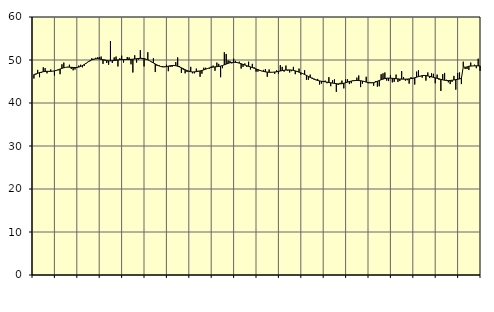
| Category | Piggar | Series 1 |
|---|---|---|
| nan | 45.7 | 46.63 |
| 1.0 | 46.6 | 46.76 |
| 1.0 | 47.7 | 46.9 |
| 1.0 | 46 | 47.05 |
| 1.0 | 47 | 47.17 |
| 1.0 | 48.3 | 47.28 |
| 1.0 | 48.1 | 47.33 |
| 1.0 | 46.9 | 47.36 |
| 1.0 | 47.3 | 47.36 |
| 1.0 | 47.8 | 47.36 |
| 1.0 | 47.4 | 47.39 |
| 1.0 | 46.4 | 47.47 |
| nan | 47.5 | 47.58 |
| 2.0 | 47.6 | 47.74 |
| 2.0 | 46.7 | 47.9 |
| 2.0 | 49 | 48.06 |
| 2.0 | 49.4 | 48.2 |
| 2.0 | 48.3 | 48.29 |
| 2.0 | 48.4 | 48.34 |
| 2.0 | 48.9 | 48.33 |
| 2.0 | 47.9 | 48.3 |
| 2.0 | 47.6 | 48.27 |
| 2.0 | 47.8 | 48.24 |
| 2.0 | 48.2 | 48.27 |
| nan | 48.7 | 48.35 |
| 3.0 | 48.9 | 48.5 |
| 3.0 | 48.3 | 48.71 |
| 3.0 | 48.6 | 48.97 |
| 3.0 | 49.2 | 49.26 |
| 3.0 | 49.6 | 49.55 |
| 3.0 | 49.7 | 49.81 |
| 3.0 | 50.4 | 50.03 |
| 3.0 | 50 | 50.19 |
| 3.0 | 50.5 | 50.27 |
| 3.0 | 50.6 | 50.29 |
| 3.0 | 50.7 | 50.25 |
| nan | 50.8 | 50.16 |
| 4.0 | 49.1 | 50.05 |
| 4.0 | 50.1 | 49.95 |
| 4.0 | 49.3 | 49.86 |
| 4.0 | 48.9 | 49.81 |
| 4.0 | 54.4 | 49.8 |
| 4.0 | 49.3 | 49.83 |
| 4.0 | 50.6 | 49.88 |
| 4.0 | 50.8 | 49.95 |
| 4.0 | 48.5 | 50.02 |
| 4.0 | 50.4 | 50.07 |
| 4.0 | 51 | 50.09 |
| nan | 49.4 | 50.09 |
| 5.0 | 50 | 50.1 |
| 5.0 | 50.7 | 50.11 |
| 5.0 | 50.6 | 50.12 |
| 5.0 | 49 | 50.15 |
| 5.0 | 47.1 | 50.19 |
| 5.0 | 51.1 | 50.24 |
| 5.0 | 49.4 | 50.3 |
| 5.0 | 50.1 | 50.35 |
| 5.0 | 52.3 | 50.38 |
| 5.0 | 50.2 | 50.38 |
| 5.0 | 48.5 | 50.32 |
| nan | 50.1 | 50.2 |
| 6.0 | 51.8 | 50.03 |
| 6.0 | 49.8 | 49.82 |
| 6.0 | 49.5 | 49.58 |
| 6.0 | 50.4 | 49.32 |
| 6.0 | 47.2 | 49.08 |
| 6.0 | 48.6 | 48.84 |
| 6.0 | 48.8 | 48.63 |
| 6.0 | 48.5 | 48.48 |
| 6.0 | 48.6 | 48.4 |
| 6.0 | 48.5 | 48.39 |
| 6.0 | 48.9 | 48.46 |
| nan | 47.4 | 48.57 |
| 7.0 | 48.4 | 48.67 |
| 7.0 | 48.4 | 48.72 |
| 7.0 | 48.7 | 48.73 |
| 7.0 | 49.5 | 48.67 |
| 7.0 | 50.6 | 48.55 |
| 7.0 | 48.6 | 48.38 |
| 7.0 | 47 | 48.19 |
| 7.0 | 47.7 | 47.97 |
| 7.0 | 46.9 | 47.75 |
| 7.0 | 47.2 | 47.54 |
| 7.0 | 47.5 | 47.38 |
| nan | 48.4 | 47.27 |
| 8.0 | 46.9 | 47.22 |
| 8.0 | 46.9 | 47.24 |
| 8.0 | 48 | 47.29 |
| 8.0 | 47.5 | 47.37 |
| 8.0 | 46.1 | 47.46 |
| 8.0 | 46.8 | 47.57 |
| 8.0 | 48.2 | 47.7 |
| 8.0 | 48.2 | 47.86 |
| 8.0 | 48.1 | 48.02 |
| 8.0 | 48 | 48.16 |
| 8.0 | 48.5 | 48.27 |
| nan | 48.7 | 48.35 |
| 9.0 | 47.5 | 48.4 |
| 9.0 | 49.4 | 48.45 |
| 9.0 | 49.1 | 48.5 |
| 9.0 | 46 | 48.58 |
| 9.0 | 48.1 | 48.71 |
| 9.0 | 51.8 | 48.87 |
| 9.0 | 51.4 | 49.05 |
| 9.0 | 49.9 | 49.22 |
| 9.0 | 49.8 | 49.35 |
| 9.0 | 49.2 | 49.44 |
| 9.0 | 50.3 | 49.47 |
| nan | 49.8 | 49.45 |
| 10.0 | 49.3 | 49.38 |
| 10.0 | 49.6 | 49.27 |
| 10.0 | 48 | 49.13 |
| 10.0 | 48.4 | 48.98 |
| 10.0 | 49.2 | 48.82 |
| 10.0 | 48.4 | 48.67 |
| 10.0 | 49.6 | 48.53 |
| 10.0 | 47.8 | 48.39 |
| 10.0 | 49.1 | 48.24 |
| 10.0 | 48.3 | 48.08 |
| 10.0 | 47.3 | 47.92 |
| nan | 47.3 | 47.76 |
| 11.0 | 47.5 | 47.6 |
| 11.0 | 47.4 | 47.46 |
| 11.0 | 47.7 | 47.34 |
| 11.0 | 47.9 | 47.25 |
| 11.0 | 46.1 | 47.19 |
| 11.0 | 47.8 | 47.15 |
| 11.0 | 47.1 | 47.15 |
| 11.0 | 47.2 | 47.16 |
| 11.0 | 46.8 | 47.21 |
| 11.0 | 47.6 | 47.27 |
| 11.0 | 46.8 | 47.35 |
| nan | 48.8 | 47.44 |
| 12.0 | 48.4 | 47.54 |
| 12.0 | 47.3 | 47.61 |
| 12.0 | 48.7 | 47.66 |
| 12.0 | 47.5 | 47.69 |
| 12.0 | 47.1 | 47.69 |
| 12.0 | 47.4 | 47.66 |
| 12.0 | 48.4 | 47.58 |
| 12.0 | 46.7 | 47.47 |
| 12.0 | 47.2 | 47.34 |
| 12.0 | 48 | 47.18 |
| 12.0 | 46.6 | 47.01 |
| nan | 46.9 | 46.83 |
| 13.0 | 47.6 | 46.63 |
| 13.0 | 45.4 | 46.42 |
| 13.0 | 45.4 | 46.19 |
| 13.0 | 46.6 | 45.96 |
| 13.0 | 45.9 | 45.74 |
| 13.0 | 45.7 | 45.54 |
| 13.0 | 45.5 | 45.37 |
| 13.0 | 45.6 | 45.24 |
| 13.0 | 44.3 | 45.14 |
| 13.0 | 44.5 | 45.06 |
| 13.0 | 45.1 | 44.99 |
| nan | 45.2 | 44.93 |
| 14.0 | 44.6 | 44.85 |
| 14.0 | 46 | 44.77 |
| 14.0 | 43.9 | 44.7 |
| 14.0 | 45.3 | 44.63 |
| 14.0 | 45.5 | 44.56 |
| 14.0 | 42.6 | 44.5 |
| 14.0 | 44.2 | 44.45 |
| 14.0 | 44.7 | 44.45 |
| 14.0 | 45.2 | 44.49 |
| 14.0 | 43.4 | 44.59 |
| 14.0 | 45.5 | 44.72 |
| nan | 45.5 | 44.86 |
| 15.0 | 44.4 | 44.99 |
| 15.0 | 44.6 | 45.1 |
| 15.0 | 45.3 | 45.18 |
| 15.0 | 45.3 | 45.22 |
| 15.0 | 45.9 | 45.23 |
| 15.0 | 46.4 | 45.22 |
| 15.0 | 43.7 | 45.18 |
| 15.0 | 44.5 | 45.1 |
| 15.0 | 44.9 | 44.99 |
| 15.0 | 46.1 | 44.86 |
| 15.0 | 44.6 | 44.75 |
| nan | 44.9 | 44.69 |
| 16.0 | 44.8 | 44.68 |
| 16.0 | 44 | 44.75 |
| 16.0 | 45.1 | 44.88 |
| 16.0 | 43.8 | 45.05 |
| 16.0 | 43.9 | 45.24 |
| 16.0 | 46.7 | 45.41 |
| 16.0 | 46.9 | 45.56 |
| 16.0 | 47.1 | 45.68 |
| 16.0 | 45.2 | 45.76 |
| 16.0 | 45.1 | 45.79 |
| 16.0 | 46.5 | 45.78 |
| nan | 44.8 | 45.74 |
| 17.0 | 44.9 | 45.7 |
| 17.0 | 46.6 | 45.65 |
| 17.0 | 44.9 | 45.61 |
| 17.0 | 45.1 | 45.57 |
| 17.0 | 47.4 | 45.55 |
| 17.0 | 46 | 45.55 |
| 17.0 | 45.2 | 45.55 |
| 17.0 | 45.3 | 45.56 |
| 17.0 | 44.5 | 45.6 |
| 17.0 | 46 | 45.67 |
| 17.0 | 45.6 | 45.76 |
| nan | 44.3 | 45.87 |
| 18.0 | 47.3 | 46 |
| 18.0 | 47.6 | 46.14 |
| 18.0 | 46.2 | 46.27 |
| 18.0 | 45.9 | 46.37 |
| 18.0 | 46.4 | 46.41 |
| 18.0 | 45.2 | 46.38 |
| 18.0 | 47.1 | 46.3 |
| 18.0 | 45.8 | 46.19 |
| 18.0 | 46.9 | 46.08 |
| 18.0 | 46.8 | 45.96 |
| 18.0 | 44.6 | 45.85 |
| nan | 46.6 | 45.74 |
| 19.0 | 45.4 | 45.63 |
| 19.0 | 42.8 | 45.5 |
| 19.0 | 46.7 | 45.38 |
| 19.0 | 47 | 45.29 |
| 19.0 | 45.4 | 45.23 |
| 19.0 | 44.8 | 45.22 |
| 19.0 | 44.4 | 45.25 |
| 19.0 | 44.9 | 45.29 |
| 19.0 | 46.3 | 45.36 |
| 19.0 | 43.1 | 45.43 |
| 19.0 | 47 | 45.52 |
| nan | 47.1 | 45.61 |
| 20.0 | 44.4 | 45.72 |
| 20.0 | 49.6 | 48.43 |
| 20.0 | 47.9 | 48.31 |
| 20.0 | 47.9 | 48.38 |
| 20.0 | 47.7 | 48.56 |
| 20.0 | 49.4 | 48.59 |
| 20.0 | 48.6 | 48.62 |
| 20.0 | 48.9 | 48.64 |
| 20.0 | 48.1 | 48.65 |
| 20.0 | 50.3 | 48.64 |
| 20.0 | 47.5 | 48.63 |